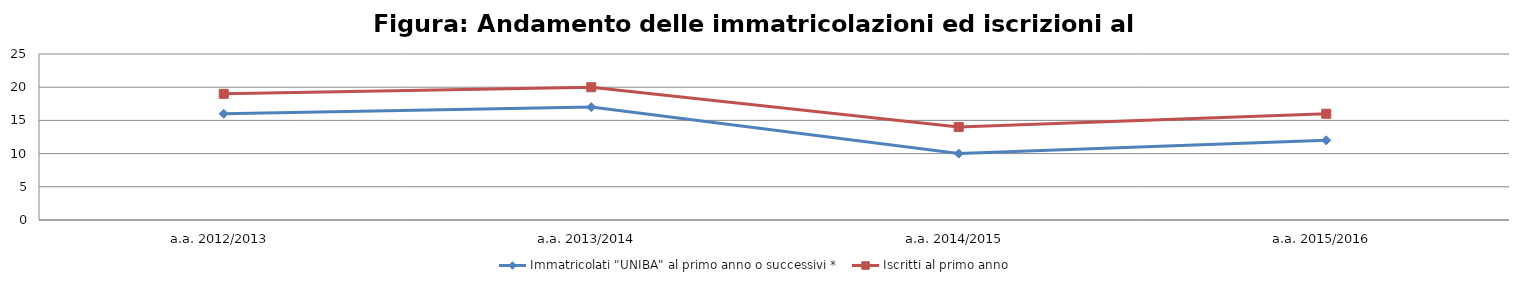
| Category | Immatricolati "UNIBA" al primo anno o successivi * | Iscritti al primo anno  |
|---|---|---|
| a.a. 2012/2013 | 16 | 19 |
| a.a. 2013/2014 | 17 | 20 |
| a.a. 2014/2015 | 10 | 14 |
| a.a. 2015/2016 | 12 | 16 |